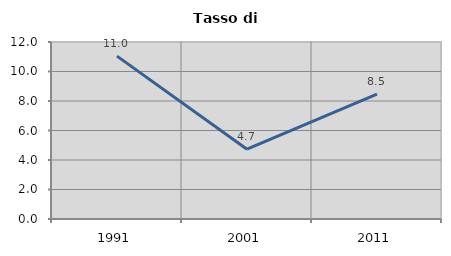
| Category | Tasso di disoccupazione   |
|---|---|
| 1991.0 | 11.043 |
| 2001.0 | 4.733 |
| 2011.0 | 8.469 |